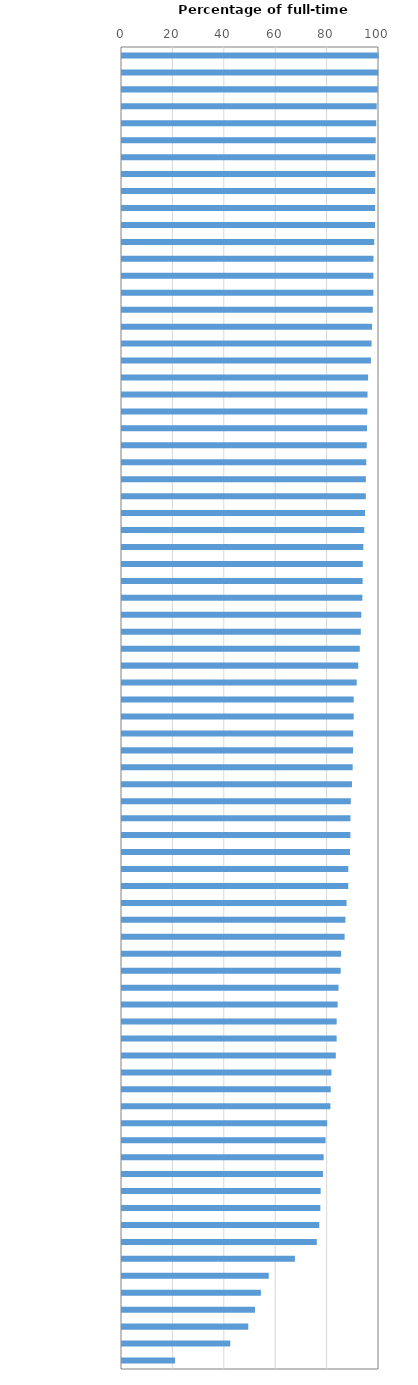
| Category | Percentage of full time teachers |
|---|---|
| Qatar | 99.849 |
| Malaysia | 99.696 |
| Brunei Darussalam | 99.53 |
| Baku (Azerbaijan) | 99.102 |
| United Arab Emirates | 98.933 |
| Philippines | 98.74 |
| Hong Kong (China) | 98.598 |
| B-S-J-Z (China) | 98.576 |
| Jordan | 98.537 |
| Malta | 98.481 |
| Saudi Arabia | 98.475 |
| Bulgaria | 98.161 |
| Viet Nam | 97.85 |
| Turkey | 97.819 |
| Colombia | 97.807 |
| Singapore | 97.603 |
| Russia | 97.304 |
| Albania | 97.098 |
| United States | 96.869 |
| Kazakhstan | 95.763 |
| Slovenia | 95.528 |
| Canada | 95.449 |
| Belarus | 95.346 |
| Panama | 95.234 |
| Korea | 95.055 |
| Finland | 94.885 |
| Ireland | 94.88 |
| Hungary | 94.554 |
| Montenegro | 94.271 |
| Thailand | 93.91 |
| Kosovo | 93.692 |
| Portugal | 93.629 |
| Chinese Taipei | 93.525 |
| Spain | 93.113 |
| France | 92.926 |
| Italy | 92.525 |
| Denmark | 91.928 |
| Slovak Republic | 91.334 |
| Australia | 90.17 |
| Japan | 90.156 |
| Czech Republic | 89.95 |
| Ukraine | 89.905 |
| New Zealand | 89.759 |
| United Kingdom | 89.48 |
| Iceland | 89.032 |
| North Macedonia | 88.904 |
| Sweden | 88.864 |
| Luxembourg | 88.716 |
| Norway | 88.05 |
| Croatia | 88.031 |
| Romania | 87.389 |
| Chile | 86.941 |
| OECD average | 86.638 |
| Poland | 85.261 |
| Lithuania | 85.089 |
| Bosnia and Herzegovina | 84.249 |
| Dominican Republic | 83.913 |
| Moldova | 83.535 |
| Estonia | 83.518 |
| Serbia | 83.195 |
| Israel | 81.497 |
| Greece | 81.232 |
| Austria | 81.089 |
| Latvia | 79.835 |
| Morocco | 79.204 |
| Germany | 78.457 |
| Peru | 78.236 |
| Belgium | 77.302 |
| Georgia | 77.179 |
| Lebanon | 76.762 |
| Costa Rica | 75.811 |
| Indonesia | 67.287 |
| Mexico | 57.102 |
| Switzerland | 54.051 |
| Netherlands | 51.749 |
| Brazil | 49.141 |
| Argentina | 42.131 |
| Uruguay | 20.664 |